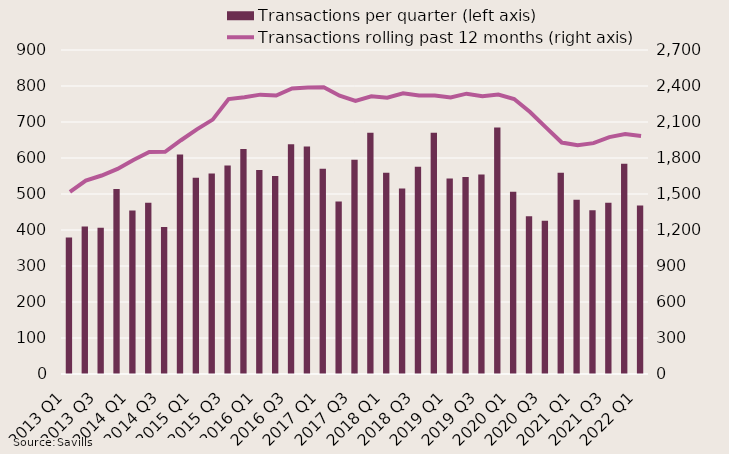
| Category | Transactions per quarter (left axis) |
|---|---|
| 2013 Q1 | 379 |
| 2013 Q2 | 410 |
| 2013 Q3 | 406 |
| 2013 Q4 | 514 |
| 2014 Q1 | 454 |
| 2014 Q2 | 476 |
| 2014 Q3 | 408 |
| 2014 Q4 | 610 |
| 2015 Q1 | 545 |
| 2015 Q2 | 557 |
| 2015 Q3 | 579 |
| 2015 Q4 | 625 |
| 2016 Q1 | 567 |
| 2016 Q2 | 550 |
| 2016 Q3 | 638 |
| 2016 Q4 | 632 |
| 2017 Q1 | 570 |
| 2017 Q2 | 479 |
| 2017 Q3 | 595 |
| 2017 Q4 | 670 |
| 2018 Q1 | 559 |
| 2018 Q2 | 515 |
| 2018 Q3 | 576 |
| 2018 Q4 | 670 |
| 2019 Q1 | 543 |
| 2019 Q2 | 547 |
| 2019 Q3 | 554 |
| 2019 Q4 | 685 |
| 2020 Q1 | 506 |
| 2020 Q2 | 438 |
| 2020 Q3 | 426 |
| 2020 Q4 | 559 |
| 2021 Q1 | 484 |
| 2021 Q2 | 455 |
| 2021 Q3 | 476 |
| 2021 Q4 | 584 |
| 2022 Q1 | 468 |